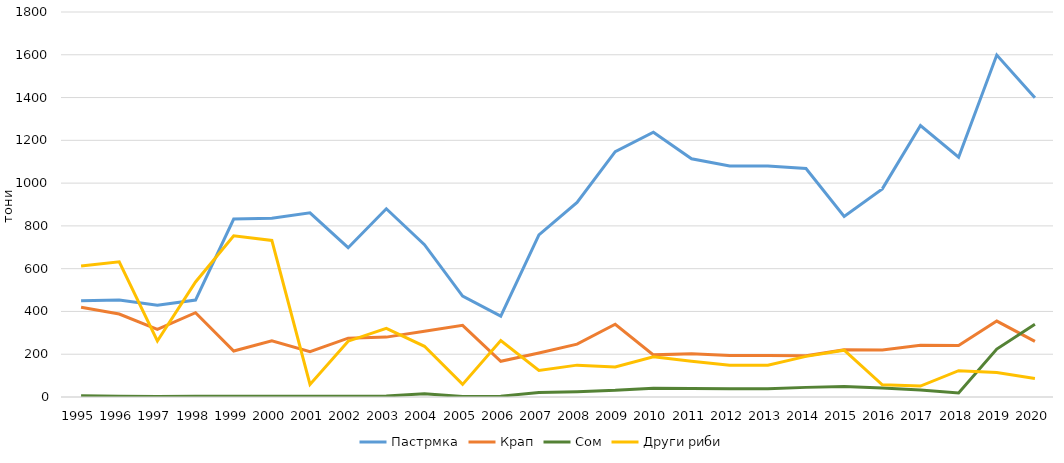
| Category | Пастрмка | Крап | Сом | Други риби |
|---|---|---|---|---|
| 1995.0 | 450 | 420 | 6 | 612 |
| 1996.0 | 454 | 388 | 3 | 632 |
| 1997.0 | 429 | 316 | 2 | 262 |
| 1998.0 | 453 | 394 | 3 | 538 |
| 1999.0 | 832 | 215 | 3 | 754 |
| 2000.0 | 836 | 263 | 3 | 732 |
| 2001.0 | 861 | 212 | 3 | 59 |
| 2002.0 | 698 | 275 | 4 | 261 |
| 2003.0 | 880 | 280 | 5 | 321 |
| 2004.0 | 712 | 307 | 15 | 237 |
| 2005.0 | 472 | 335 | 2 | 59 |
| 2006.0 | 378 | 167 | 4 | 264 |
| 2007.0 | 758 | 206 | 21 | 124 |
| 2008.0 | 910 | 247 | 25 | 149 |
| 2009.0 | 1147 | 340 | 31 | 140 |
| 2010.0 | 1238 | 197 | 41 | 188 |
| 2011.0 | 1114 | 202 | 40 | 167 |
| 2012.0 | 1080 | 194 | 38 | 149 |
| 2013.0 | 1080 | 194 | 38 | 149 |
| 2014.0 | 1068 | 193 | 45 | 190 |
| 2015.0 | 844 | 221 | 49 | 219 |
| 2016.0 | 973 | 220 | 42 | 57 |
| 2017.0 | 1269 | 242 | 33 | 51 |
| 2018.0 | 1121 | 241 | 19 | 123 |
| 2019.0 | 1599 | 355 | 224 | 114 |
| 2020.0 | 1399 | 260 | 340 | 86 |